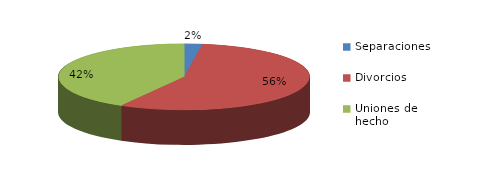
| Category | Series 0 |
|---|---|
| Separaciones | 94 |
| Divorcios | 2262 |
| Uniones de hecho | 1687 |